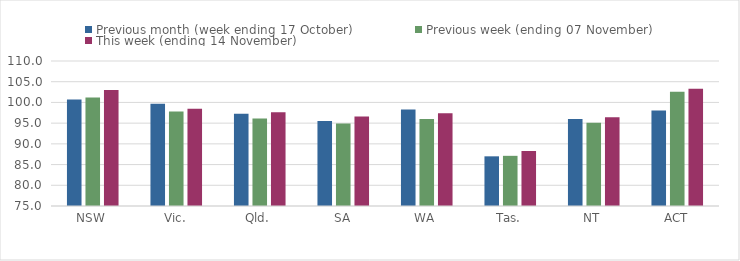
| Category | Previous month (week ending 17 October) | Previous week (ending 07 November) | This week (ending 14 November) |
|---|---|---|---|
| NSW | 100.7 | 101.19 | 102.98 |
| Vic. | 99.67 | 97.84 | 98.45 |
| Qld. | 97.26 | 96.15 | 97.65 |
| SA | 95.5 | 94.92 | 96.59 |
| WA | 98.31 | 96.03 | 97.36 |
| Tas. | 86.99 | 87.11 | 88.28 |
| NT | 96.01 | 95.1 | 96.43 |
| ACT | 98.05 | 102.6 | 103.32 |